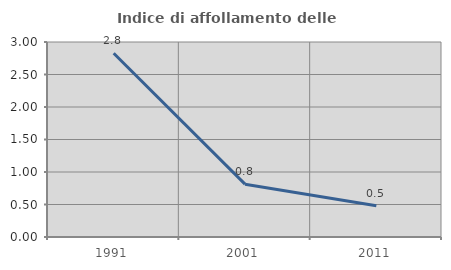
| Category | Indice di affollamento delle abitazioni  |
|---|---|
| 1991.0 | 2.827 |
| 2001.0 | 0.813 |
| 2011.0 | 0.482 |